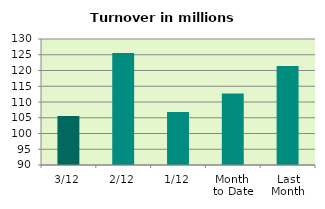
| Category | Series 0 |
|---|---|
| 3/12 | 105.545 |
| 2/12 | 125.593 |
| 1/12 | 106.842 |
| Month 
to Date | 112.66 |
| Last
Month | 121.455 |